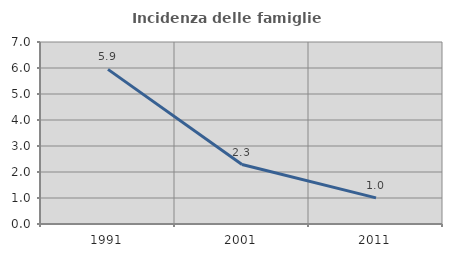
| Category | Incidenza delle famiglie numerose |
|---|---|
| 1991.0 | 5.948 |
| 2001.0 | 2.288 |
| 2011.0 | 1.006 |